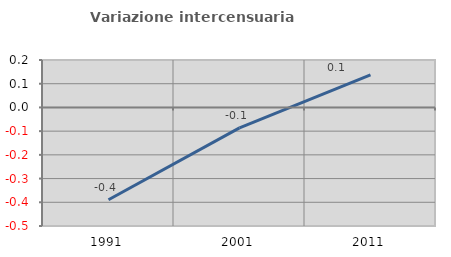
| Category | Variazione intercensuaria annua |
|---|---|
| 1991.0 | -0.389 |
| 2001.0 | -0.086 |
| 2011.0 | 0.137 |